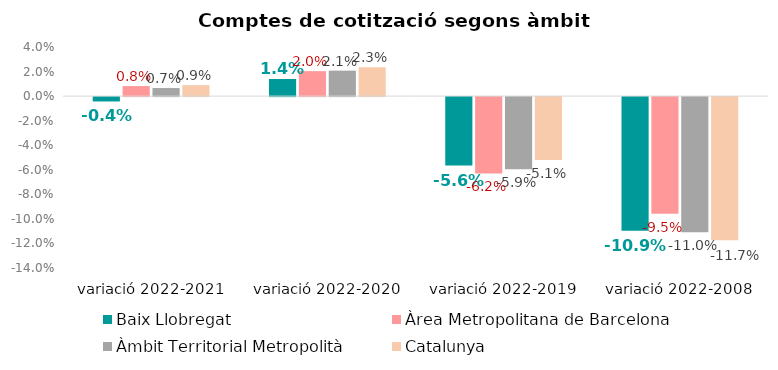
| Category | Baix Llobregat | Àrea Metropolitana de Barcelona | Àmbit Territorial Metropolità | Catalunya |
|---|---|---|---|---|
| variació 2022-2021 | -0.004 | 0.008 | 0.007 | 0.009 |
| variació 2022-2020 | 0.014 | 0.02 | 0.021 | 0.023 |
| variació 2022-2019 | -0.056 | -0.062 | -0.059 | -0.051 |
| variació 2022-2008 | -0.109 | -0.095 | -0.11 | -0.117 |